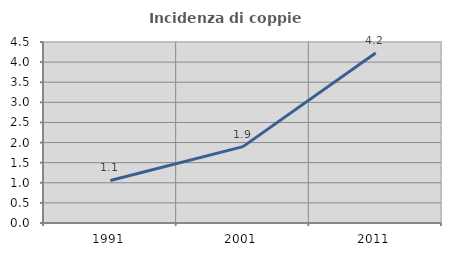
| Category | Incidenza di coppie miste |
|---|---|
| 1991.0 | 1.057 |
| 2001.0 | 1.899 |
| 2011.0 | 4.228 |